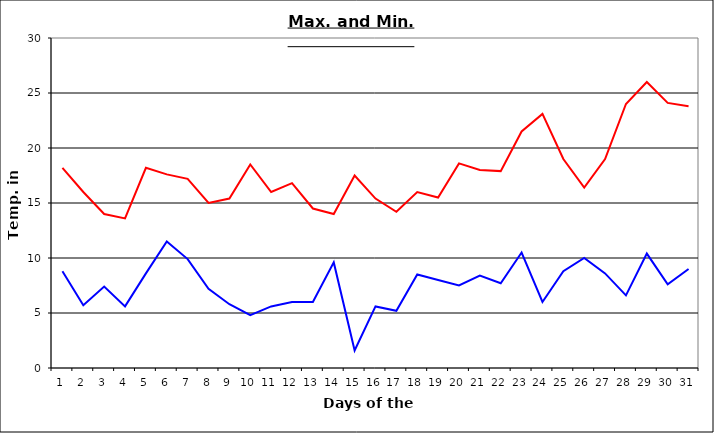
| Category | Series 0 | Series 1 |
|---|---|---|
| 0 | 18.2 | 8.8 |
| 1 | 16 | 5.7 |
| 2 | 14 | 7.4 |
| 3 | 13.6 | 5.6 |
| 4 | 18.2 | 8.6 |
| 5 | 17.6 | 11.5 |
| 6 | 17.2 | 9.9 |
| 7 | 15 | 7.2 |
| 8 | 15.4 | 5.8 |
| 9 | 18.5 | 4.8 |
| 10 | 16 | 5.6 |
| 11 | 16.8 | 6 |
| 12 | 14.5 | 6 |
| 13 | 14 | 9.6 |
| 14 | 17.5 | 1.6 |
| 15 | 15.4 | 5.6 |
| 16 | 14.2 | 5.2 |
| 17 | 16 | 8.5 |
| 18 | 15.5 | 8 |
| 19 | 18.6 | 7.5 |
| 20 | 18 | 8.4 |
| 21 | 17.9 | 7.7 |
| 22 | 21.5 | 10.5 |
| 23 | 23.1 | 6 |
| 24 | 19 | 8.8 |
| 25 | 16.4 | 10 |
| 26 | 19 | 8.6 |
| 27 | 24 | 6.6 |
| 28 | 26 | 10.4 |
| 29 | 24.1 | 7.6 |
| 30 | 23.8 | 9 |